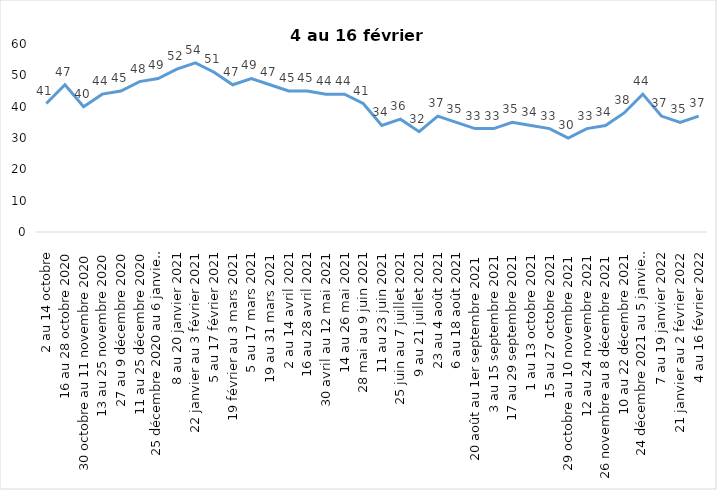
| Category | Toujours aux trois mesures |
|---|---|
| 2 au 14 octobre | 41 |
| 16 au 28 octobre 2020 | 47 |
| 30 octobre au 11 novembre 2020 | 40 |
| 13 au 25 novembre 2020 | 44 |
| 27 au 9 décembre 2020 | 45 |
| 11 au 25 décembre 2020 | 48 |
| 25 décembre 2020 au 6 janvier 2021 | 49 |
| 8 au 20 janvier 2021 | 52 |
| 22 janvier au 3 février 2021 | 54 |
| 5 au 17 février 2021 | 51 |
| 19 février au 3 mars 2021 | 47 |
| 5 au 17 mars 2021 | 49 |
| 19 au 31 mars 2021 | 47 |
| 2 au 14 avril 2021 | 45 |
| 16 au 28 avril 2021 | 45 |
| 30 avril au 12 mai 2021 | 44 |
| 14 au 26 mai 2021 | 44 |
| 28 mai au 9 juin 2021 | 41 |
| 11 au 23 juin 2021 | 34 |
| 25 juin au 7 juillet 2021 | 36 |
| 9 au 21 juillet 2021 | 32 |
| 23 au 4 août 2021 | 37 |
| 6 au 18 août 2021 | 35 |
| 20 août au 1er septembre 2021 | 33 |
| 3 au 15 septembre 2021 | 33 |
| 17 au 29 septembre 2021 | 35 |
| 1 au 13 octobre 2021 | 34 |
| 15 au 27 octobre 2021 | 33 |
| 29 octobre au 10 novembre 2021 | 30 |
| 12 au 24 novembre 2021 | 33 |
| 26 novembre au 8 décembre 2021 | 34 |
| 10 au 22 décembre 2021 | 38 |
| 24 décembre 2021 au 5 janvier 2022 2022 | 44 |
| 7 au 19 janvier 2022 | 37 |
| 21 janvier au 2 février 2022 | 35 |
| 4 au 16 février 2022 | 37 |